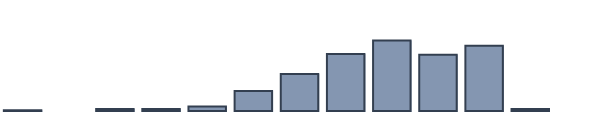
| Category | Series 0 |
|---|---|
| 0 | 0.2 |
| 1 | 0 |
| 2 | 0.6 |
| 3 | 0.6 |
| 4 | 1.4 |
| 5 | 6.3 |
| 6 | 11.7 |
| 7 | 18 |
| 8 | 22.2 |
| 9 | 17.7 |
| 10 | 20.6 |
| 11 | 0.6 |
| 12 | 0 |